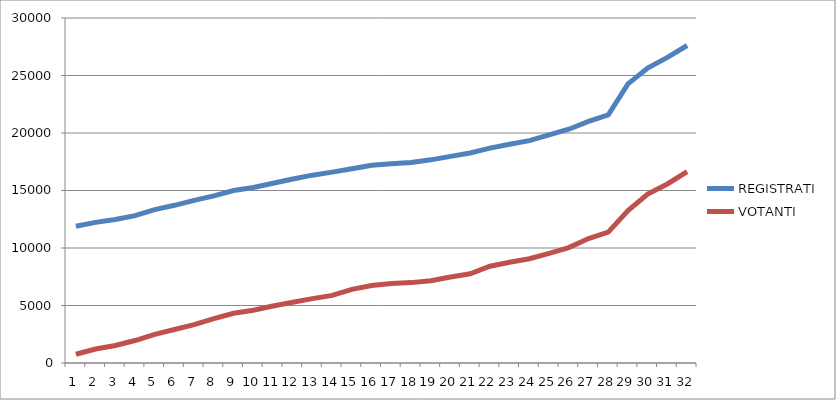
| Category | REGISTRATI | VOTANTI |
|---|---|---|
| 0 | 11891 | 762 |
| 1 | 12230 | 1217 |
| 2 | 12475 | 1520 |
| 3 | 12812 | 1955 |
| 4 | 13342 | 2489 |
| 5 | 13712 | 2915 |
| 6 | 14137 | 3340 |
| 7 | 14534 | 3851 |
| 8 | 15001 | 4326 |
| 9 | 15257 | 4592 |
| 10 | 15631 | 4951 |
| 11 | 15997 | 5284 |
| 12 | 16334 | 5596 |
| 13 | 16596 | 5877 |
| 14 | 16895 | 6405 |
| 15 | 17194 | 6737 |
| 16 | 17334 | 6903 |
| 17 | 17434 | 6990 |
| 18 | 17666 | 7159 |
| 19 | 17967 | 7480 |
| 20 | 18265 | 7754 |
| 21 | 18689 | 8414 |
| 22 | 19021 | 8765 |
| 23 | 19339 | 9067 |
| 24 | 19834 | 9534 |
| 25 | 20327 | 10036 |
| 26 | 21004 | 10820 |
| 27 | 21569 | 11380 |
| 28 | 24274 | 13256 |
| 29 | 25646 | 14689 |
| 30 | 26580 | 15567 |
| 31 | 27607 | 16649 |